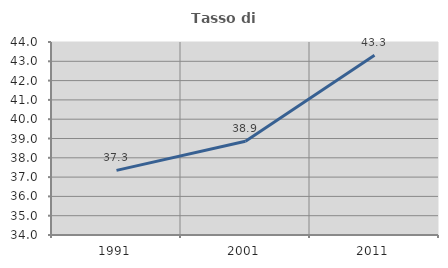
| Category | Tasso di occupazione   |
|---|---|
| 1991.0 | 37.349 |
| 2001.0 | 38.86 |
| 2011.0 | 43.316 |